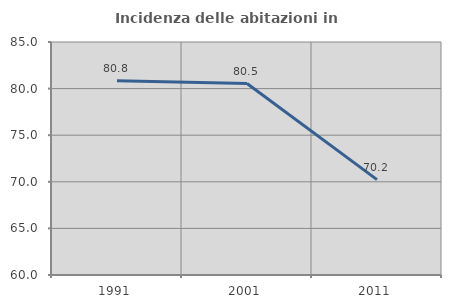
| Category | Incidenza delle abitazioni in proprietà  |
|---|---|
| 1991.0 | 80.834 |
| 2001.0 | 80.544 |
| 2011.0 | 70.234 |